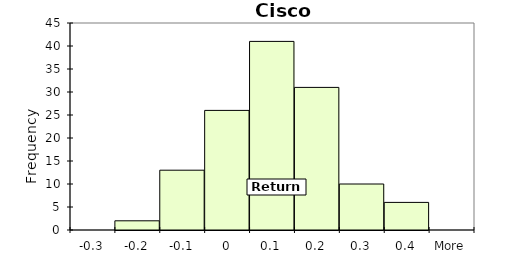
| Category | Frequency |
|---|---|
| -0.3 | 0 |
| -0.2 | 2 |
| -0.1 | 13 |
| 0 | 26 |
| 0.1 | 41 |
| 0.2 | 31 |
| 0.3 | 10 |
| 0.4 | 6 |
| More | 0 |